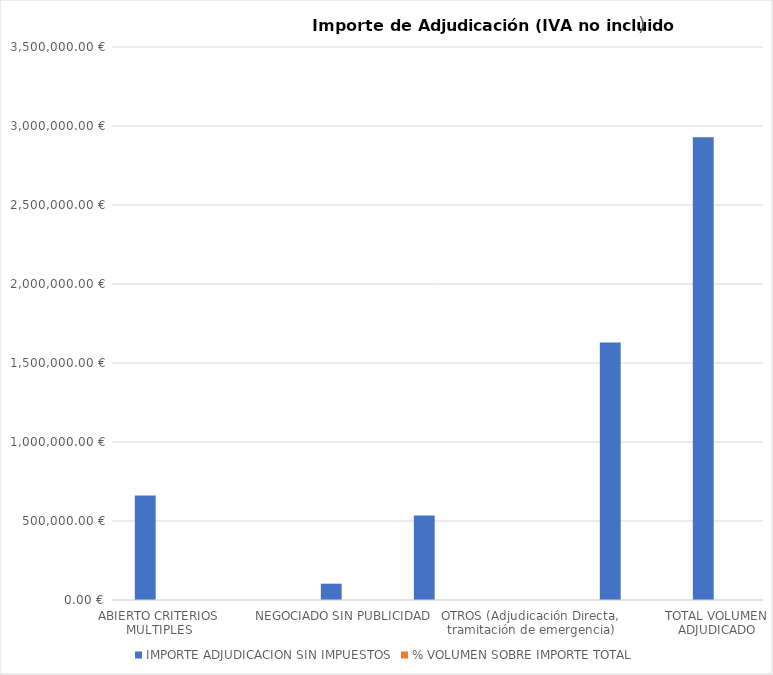
| Category | IMPORTE ADJUDICACION SIN IMPUESTOS | % VOLUMEN SOBRE IMPORTE TOTAL |
|---|---|---|
| ABIERTO CRITERIOS MULTIPLES | 662010.9 | 0.226 |
| ABIERTO SIMPLIFICADO SUMARIO | 0 | 0 |
| NEGOCIADO SIN PUBLICIDAD | 103163.48 | 0.035 |
| Contratos Basados en Acuerdo Marco | 534117.24 | 0.182 |
| OTROS (Adjudicación Directa, tramitación de emergencia) | 0 | 0 |
| CONTRATOS MENORES * | 1629436.57 | 0.556 |
| TOTAL VOLUMEN ADJUDICADO | 2928728.19 | 1 |